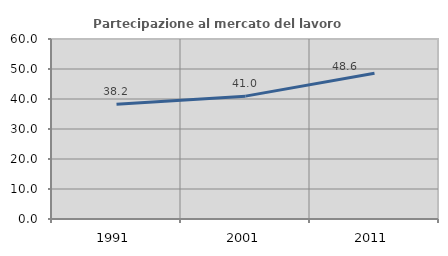
| Category | Partecipazione al mercato del lavoro  femminile |
|---|---|
| 1991.0 | 38.242 |
| 2001.0 | 40.957 |
| 2011.0 | 48.562 |